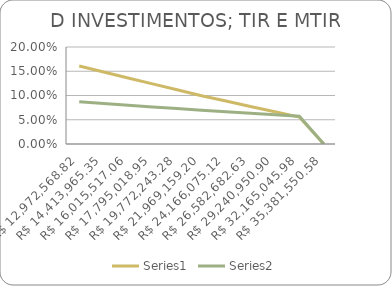
| Category | Series 0 | Series 1 |
|---|---|---|
| 12972568.816008002 | 0.161 | 0.087 |
| 14413965.35112 | 0.149 | 0.083 |
| 16015517.0568 | 0.136 | 0.08 |
| 17795018.952 | 0.124 | 0.076 |
| 19772243.28 | 0.112 | 0.073 |
| 21969159.2 | 0.1 | 0.07 |
| 24166075.12 | 0.089 | 0.067 |
| 26582682.632000003 | 0.077 | 0.063 |
| 29240950.895200007 | 0.066 | 0.06 |
| 32165045.98472001 | 0.056 | 0.057 |
| 35381550.58319201 | 0 | 0 |